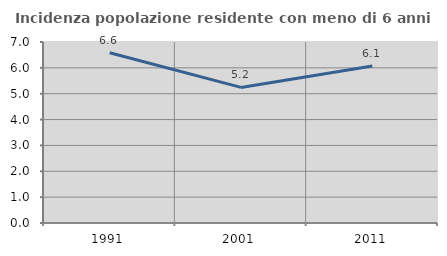
| Category | Incidenza popolazione residente con meno di 6 anni |
|---|---|
| 1991.0 | 6.586 |
| 2001.0 | 5.244 |
| 2011.0 | 6.07 |